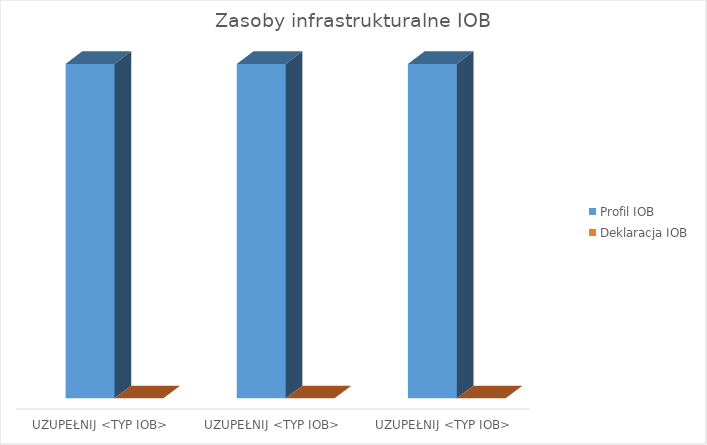
| Category | Profil IOB | Deklaracja IOB |
|---|---|---|
| UZUPEŁNIJ <TYP IOB> | 1 | 0 |
| UZUPEŁNIJ <TYP IOB> | 1 | 0 |
| UZUPEŁNIJ <TYP IOB> | 1 | 0 |